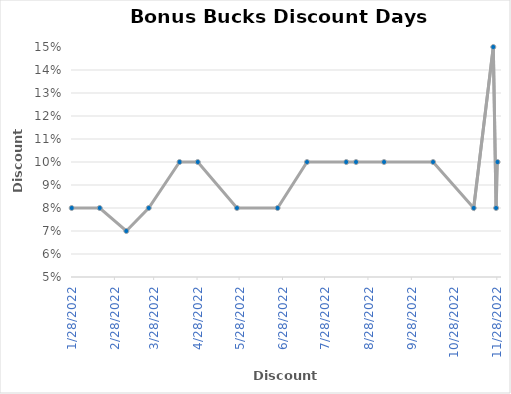
| Category | Discount |
|---|---|
| 11/28/22 | 0.1 |
| 11/27/22 | 0.08 |
| 11/25/22 | 0.15 |
| 11/11/22 | 0.08 |
| 10/13/22 | 0.1 |
| 9/8/22 | 0.1 |
| 8/19/22 | 0.1 |
| 8/12/22 | 0.1 |
| 7/15/22 | 0.1 |
| 6/24/22 | 0.08 |
| 5/26/22 | 0.08 |
| 4/28/22 | 0.1 |
| 4/15/22 | 0.1 |
| 3/24/22 | 0.08 |
| 3/8/22 | 0.07 |
| 2/17/22 | 0.08 |
| 1/28/22 | 0.08 |